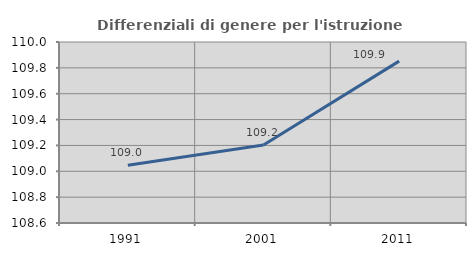
| Category | Differenziali di genere per l'istruzione superiore |
|---|---|
| 1991.0 | 109.046 |
| 2001.0 | 109.204 |
| 2011.0 | 109.852 |